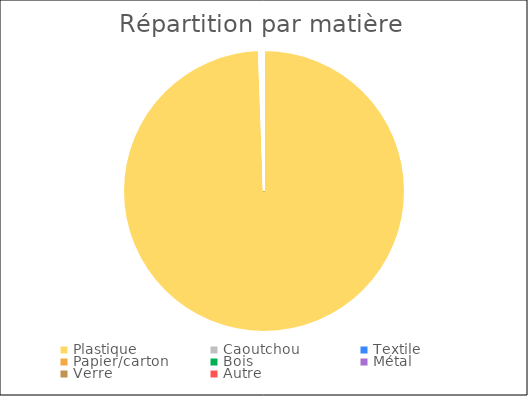
| Category | Series 0 |
|---|---|
| Plastique | 2408 |
| Caoutchou  | 3 |
| Textile  | 0 |
| Papier/carton  | 6 |
| Bois | 2 |
| Métal | 1 |
| Verre | 2 |
| Autre | 0 |